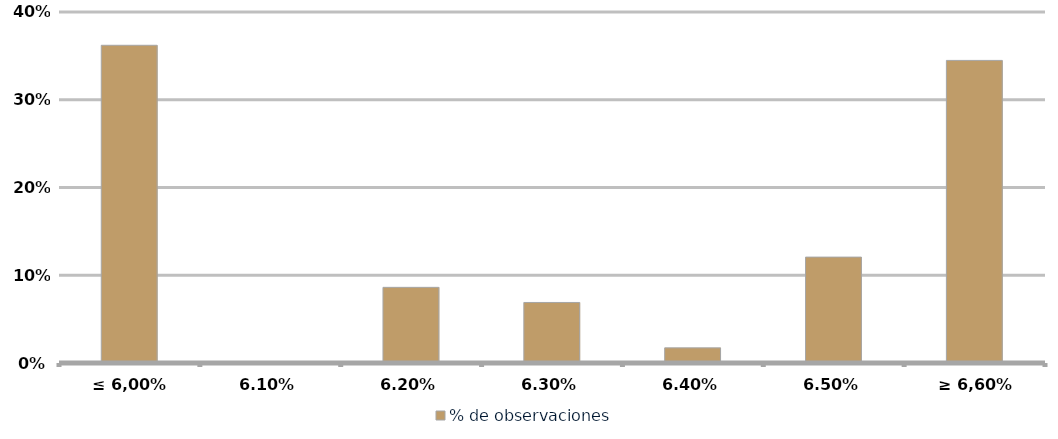
| Category | % de observaciones  |
|---|---|
| ≤ 6,00% | 0.362 |
| 6,10% | 0 |
| 6,20% | 0.086 |
| 6,30% | 0.069 |
| 6,40% | 0.017 |
| 6,50% | 0.121 |
| ≥ 6,60% | 0.345 |